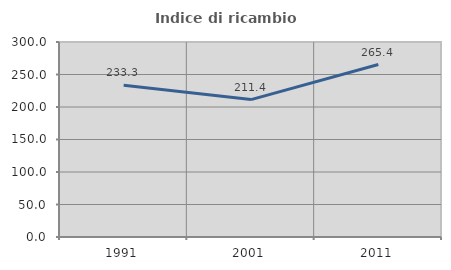
| Category | Indice di ricambio occupazionale  |
|---|---|
| 1991.0 | 233.333 |
| 2001.0 | 211.429 |
| 2011.0 | 265.385 |